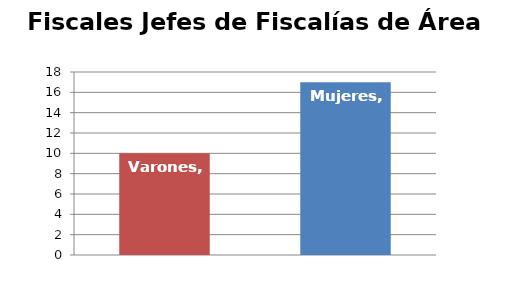
| Category | Fiscales Jefes de Fiscalías de Área  |
|---|---|
| Varones | 10 |
| Mujeres | 17 |